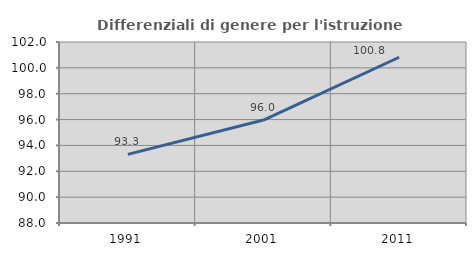
| Category | Differenziali di genere per l'istruzione superiore |
|---|---|
| 1991.0 | 93.306 |
| 2001.0 | 95.962 |
| 2011.0 | 100.82 |